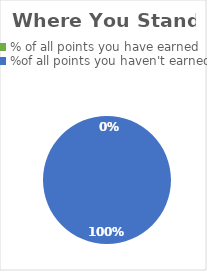
| Category | Series 0 |
|---|---|
| % of all points you have earned | 0 |
| %of all points you haven't earned | 1 |